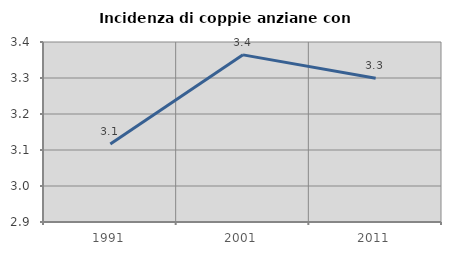
| Category | Incidenza di coppie anziane con figli |
|---|---|
| 1991.0 | 3.117 |
| 2001.0 | 3.364 |
| 2011.0 | 3.299 |